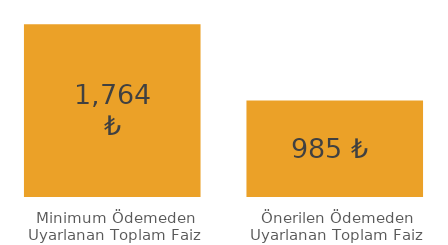
| Category | Series 0 |
|---|---|
| Minimum Ödemeden Uyarlanan Toplam Faiz | 1763.952 |
| Önerilen Ödemeden Uyarlanan Toplam Faiz | 984.811 |